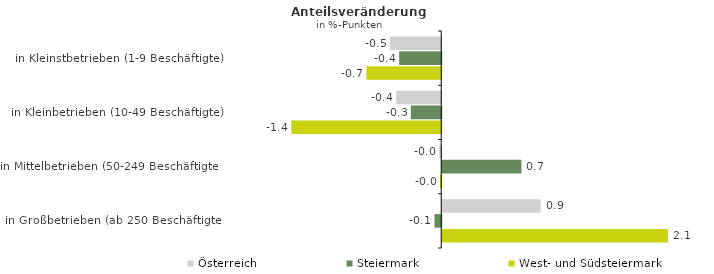
| Category | Österreich | Steiermark | West- und Südsteiermark |
|---|---|---|---|
| in Kleinstbetrieben (1-9 Beschäftigte) | -0.48 | -0.393 | -0.698 |
| in Kleinbetrieben (10-49 Beschäftigte) | -0.42 | -0.284 | -1.399 |
| in Mittelbetrieben (50-249 Beschäftigte) | -0.019 | 0.74 | -0.012 |
| in Großbetrieben (ab 250 Beschäftigte) | 0.919 | -0.063 | 2.108 |